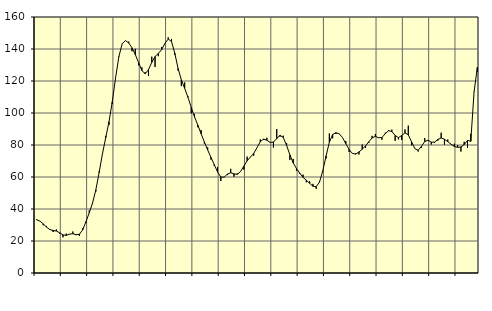
| Category | Piggar | Series 1 |
|---|---|---|
| nan | 33.7 | 33.27 |
| 87.0 | 32.4 | 32.41 |
| 87.0 | 29.8 | 30.77 |
| 87.0 | 29.4 | 28.66 |
| nan | 27.3 | 27.15 |
| 88.0 | 25.6 | 26.6 |
| 88.0 | 27.2 | 26.2 |
| 88.0 | 24.6 | 25.16 |
| nan | 22.3 | 23.83 |
| 89.0 | 24.6 | 23.51 |
| 89.0 | 24.2 | 24.29 |
| 89.0 | 25.9 | 24.52 |
| nan | 23.7 | 23.93 |
| 90.0 | 23.2 | 24.19 |
| 90.0 | 28 | 26.99 |
| 90.0 | 31.2 | 32.1 |
| nan | 39.1 | 37.62 |
| 91.0 | 43.3 | 43.76 |
| 91.0 | 50.9 | 52 |
| 91.0 | 63.6 | 62.83 |
| nan | 74.6 | 74.41 |
| 92.0 | 85.7 | 84.52 |
| 92.0 | 92.6 | 94.58 |
| 92.0 | 105.6 | 107.08 |
| nan | 121.9 | 121.93 |
| 93.0 | 135.5 | 135.21 |
| 93.0 | 143.1 | 143.23 |
| 93.0 | 145.2 | 145.28 |
| nan | 144.6 | 143.77 |
| 94.0 | 138.6 | 140.71 |
| 94.0 | 140.1 | 136.51 |
| 94.0 | 129.8 | 131.49 |
| nan | 128.5 | 126.51 |
| 95.0 | 125.5 | 124.56 |
| 95.0 | 123.2 | 127.06 |
| 95.0 | 135.2 | 131.61 |
| nan | 128.8 | 135.3 |
| 96.0 | 135.5 | 137.23 |
| 96.0 | 141.3 | 139.59 |
| 96.0 | 143.6 | 143.42 |
| nan | 147.2 | 146.19 |
| 97.0 | 146.3 | 144.7 |
| 97.0 | 136.4 | 137.43 |
| 97.0 | 126.5 | 127.88 |
| nan | 116.8 | 120.71 |
| 98.0 | 119.1 | 115.44 |
| 98.0 | 110.5 | 109.83 |
| 98.0 | 99.8 | 103.6 |
| nan | 99.4 | 97.58 |
| 99.0 | 91.1 | 92.44 |
| 99.0 | 89.4 | 87.06 |
| 99.0 | 80.9 | 81.87 |
| nan | 78.5 | 76.89 |
| 0.0 | 70.9 | 72.23 |
| 0.0 | 66.9 | 67.76 |
| 0.0 | 66.2 | 63.17 |
| nan | 57.5 | 59.96 |
| 1.0 | 60 | 59.9 |
| 1.0 | 61.2 | 61.82 |
| 1.0 | 65.1 | 62.67 |
| nan | 60.2 | 61.98 |
| 2.0 | 62.2 | 61.65 |
| 2.0 | 63.3 | 63.36 |
| 2.0 | 64.6 | 66.81 |
| nan | 72.7 | 70.11 |
| 3.0 | 72.6 | 72.47 |
| 3.0 | 73.3 | 74.76 |
| 3.0 | 78.4 | 78.36 |
| nan | 83.5 | 82.03 |
| 4.0 | 83.3 | 83.7 |
| 4.0 | 84.5 | 82.99 |
| 4.0 | 81.5 | 81.59 |
| nan | 78.4 | 81.84 |
| 5.0 | 90 | 84.03 |
| 5.0 | 85.2 | 86.05 |
| 5.0 | 85.8 | 84.65 |
| nan | 81.1 | 79.73 |
| 6.0 | 70.7 | 73.86 |
| 6.0 | 71.3 | 68.84 |
| 6.0 | 64 | 65.33 |
| nan | 61.9 | 62.37 |
| 7.0 | 61.5 | 59.78 |
| 7.0 | 56.7 | 57.97 |
| 7.0 | 57.3 | 56.04 |
| nan | 55.7 | 54.23 |
| 8.0 | 52.6 | 53.98 |
| 8.0 | 57.5 | 56.78 |
| 8.0 | 63.3 | 63.81 |
| nan | 71.6 | 73.12 |
| 9.0 | 87.2 | 81.73 |
| 9.0 | 84.2 | 86.56 |
| 9.0 | 86.9 | 87.7 |
| nan | 86.9 | 86.98 |
| 10.0 | 84.6 | 84.69 |
| 10.0 | 82.4 | 80.8 |
| 10.0 | 75.6 | 77.17 |
| nan | 74.8 | 74.76 |
| 11.0 | 74.7 | 74.31 |
| 11.0 | 74.1 | 75.65 |
| 11.0 | 80.3 | 77.38 |
| nan | 78.2 | 79.42 |
| 12.0 | 81.3 | 82 |
| 12.0 | 85.7 | 84.43 |
| 12.0 | 86.9 | 85.36 |
| nan | 84.4 | 84.52 |
| 13.0 | 83.3 | 84.71 |
| 13.0 | 87.7 | 87.05 |
| 13.0 | 89.4 | 88.94 |
| nan | 89.6 | 88.38 |
| 14.0 | 82.6 | 85.95 |
| 14.0 | 83.5 | 84.62 |
| 14.0 | 83.1 | 85.94 |
| nan | 89.7 | 87.58 |
| 15.0 | 92.1 | 86.37 |
| 15.0 | 79.8 | 81.96 |
| 15.0 | 77.7 | 77.68 |
| nan | 75.9 | 76.68 |
| 16.0 | 78.2 | 79.14 |
| 16.0 | 84.3 | 82.16 |
| 16.0 | 82.6 | 82.96 |
| nan | 80.3 | 81.78 |
| 17.0 | 81.4 | 81.8 |
| 17.0 | 82.7 | 83.48 |
| 17.0 | 87.7 | 84.4 |
| nan | 80.2 | 83.58 |
| 18.0 | 83.4 | 82.11 |
| 18.0 | 80.4 | 80.54 |
| 18.0 | 80.8 | 79.06 |
| nan | 80 | 78.54 |
| 19.0 | 75.9 | 78.77 |
| 19.0 | 82 | 80.24 |
| 19.0 | 78.1 | 82.87 |
| nan | 87 | 82.32 |
| 20.0 | 113.4 | 113.22 |
| 20.0 | 125.6 | 128.57 |